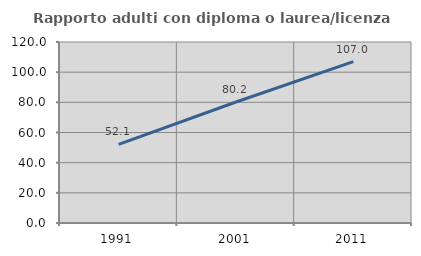
| Category | Rapporto adulti con diploma o laurea/licenza media  |
|---|---|
| 1991.0 | 52.115 |
| 2001.0 | 80.207 |
| 2011.0 | 107.016 |